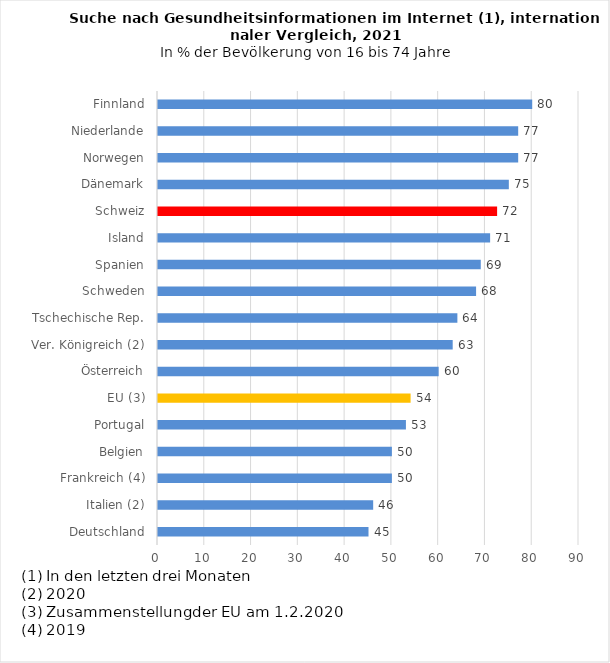
| Category | Series 0 |
|---|---|
| Deutschland | 45 |
| Italien (2) | 46 |
| Frankreich (4) | 50 |
| Belgien | 50 |
| Portugal | 53 |
| EU (3) | 54 |
| Österreich | 60 |
| Ver. Königreich (2) | 63 |
| Tschechische Rep. | 64 |
| Schweden | 68 |
| Spanien | 69 |
| Island | 71 |
| Schweiz | 72.495 |
| Dänemark | 75 |
| Norwegen | 77 |
| Niederlande | 77 |
| Finnland | 80 |